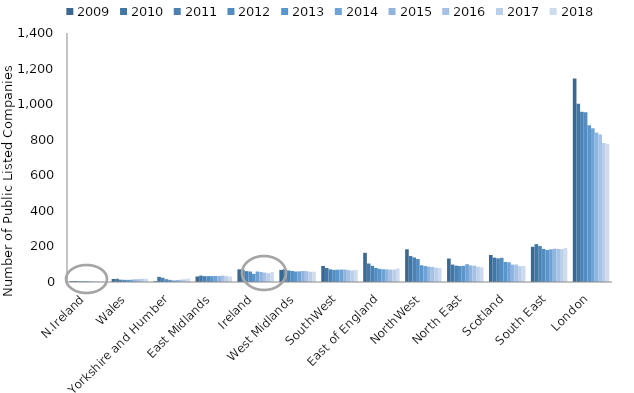
| Category | 2009 | 2010 | 2011 | 2012 | 2013 | 2014 | 2015 | 2016 | 2017 | 2018 |
|---|---|---|---|---|---|---|---|---|---|---|
| N.Ireland | 4 | 5 | 4 | 4 | 4 | 3 | 2 | 3 | 2 | 4 |
| Wales | 17 | 18 | 13 | 12 | 12 | 13 | 15 | 16 | 18 | 18 |
| Yorkshire and Humber | 4 | 29 | 24 | 16 | 12 | 9 | 11 | 13 | 15 | 19 |
| East Midlands | 31 | 36 | 33 | 33 | 33 | 34 | 34 | 36 | 33 | 31 |
| Ireland | 71 | 69 | 61 | 59 | 46 | 59 | 56 | 53 | 49 | 55 |
| West Midlands | 68 | 72 | 65 | 62 | 59 | 60 | 62 | 61 | 57 | 58 |
| SouthWest | 90 | 79 | 71 | 68 | 69 | 70 | 70 | 67 | 65 | 68 |
| East of England | 164 | 104 | 91 | 79 | 74 | 72 | 71 | 70 | 70 | 76 |
| NorthWest | 184 | 146 | 138 | 129 | 94 | 90 | 86 | 85 | 80 | 79 |
| North East | 132 | 98 | 92 | 90 | 91 | 100 | 93 | 92 | 86 | 83 |
| Scotland | 152 | 137 | 133 | 136 | 113 | 111 | 98 | 98 | 89 | 90 |
| South East | 198 | 213 | 202 | 186 | 180 | 184 | 187 | 186 | 185 | 191 |
| London | 1144 | 1002 | 957 | 955 | 881 | 864 | 840 | 830 | 781 | 777 |